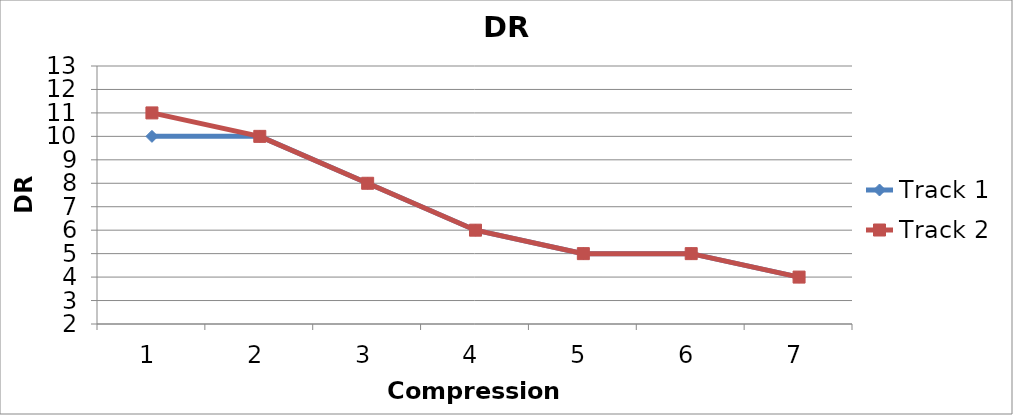
| Category | Track 1 | Track 2 |
|---|---|---|
| 0 | 10 | 11 |
| 1 | 10 | 10 |
| 2 | 8 | 8 |
| 3 | 6 | 6 |
| 4 | 5 | 5 |
| 5 | 5 | 5 |
| 6 | 4 | 4 |